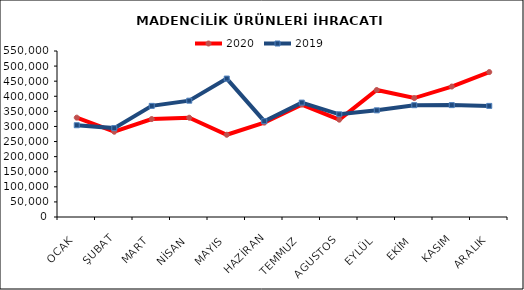
| Category | 2020 | 2019 |
|---|---|---|
| OCAK | 329222.773 | 304008.428 |
| ŞUBAT | 282564.321 | 294499.689 |
| MART | 324512.098 | 368202.372 |
| NİSAN | 328934.36 | 385406.8 |
| MAYIS | 272471.243 | 458634.298 |
| HAZİRAN | 312612.13 | 317511.665 |
| TEMMUZ | 372336.745 | 379020.891 |
| AGUSTOS | 322428.475 | 340264.702 |
| EYLÜL | 420729.836 | 353396.994 |
| EKİM | 394133.515 | 370443.195 |
| KASIM | 432245.45 | 370700.387 |
| ARALIK | 480200.45 | 368116.692 |